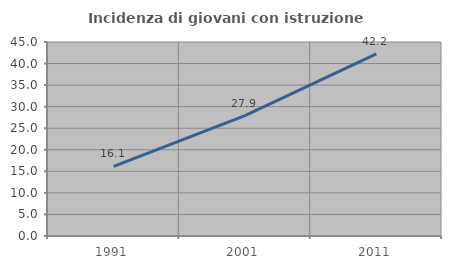
| Category | Incidenza di giovani con istruzione universitaria |
|---|---|
| 1991.0 | 16.132 |
| 2001.0 | 27.925 |
| 2011.0 | 42.227 |